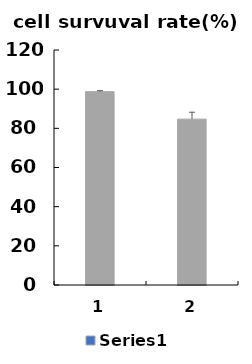
| Category | Series 0 |
|---|---|
| 0 | 98.733 |
| 1 | 84.7 |